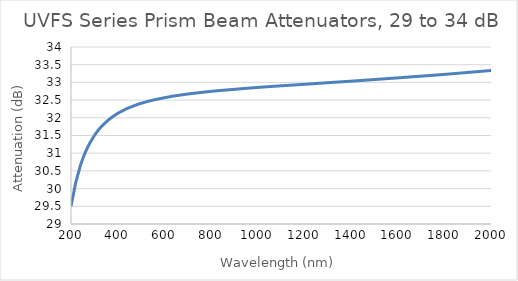
| Category | UVFS Series Prism Beam Attenuators, 29 to 34 dB |
|---|---|
| 200.0 | 29.499 |
| 210.0 | 29.828 |
| 220.0 | 30.166 |
| 230.0 | 30.404 |
| 240.0 | 30.647 |
| 250.0 | 30.837 |
| 260.0 | 31.004 |
| 270.0 | 31.149 |
| 280.0 | 31.28 |
| 290.0 | 31.389 |
| 300.0 | 31.499 |
| 310.0 | 31.592 |
| 320.0 | 31.676 |
| 330.0 | 31.75 |
| 340.0 | 31.817 |
| 350.0 | 31.877 |
| 360.0 | 31.938 |
| 370.0 | 31.988 |
| 380.0 | 32.038 |
| 390.0 | 32.081 |
| 400.0 | 32.124 |
| 410.0 | 32.161 |
| 420.0 | 32.194 |
| 430.0 | 32.228 |
| 440.0 | 32.261 |
| 450.0 | 32.288 |
| 460.0 | 32.314 |
| 470.0 | 32.339 |
| 480.0 | 32.365 |
| 490.0 | 32.388 |
| 500.0 | 32.407 |
| 510.0 | 32.427 |
| 520.0 | 32.446 |
| 530.0 | 32.465 |
| 540.0 | 32.482 |
| 550.0 | 32.497 |
| 560.0 | 32.511 |
| 570.0 | 32.526 |
| 580.0 | 32.54 |
| 590.0 | 32.554 |
| 600.0 | 32.567 |
| 610.0 | 32.579 |
| 620.0 | 32.591 |
| 630.0 | 32.604 |
| 640.0 | 32.614 |
| 650.0 | 32.624 |
| 660.0 | 32.634 |
| 670.0 | 32.643 |
| 680.0 | 32.653 |
| 690.0 | 32.663 |
| 700.0 | 32.672 |
| 710.0 | 32.68 |
| 720.0 | 32.688 |
| 730.0 | 32.695 |
| 740.0 | 32.703 |
| 750.0 | 32.711 |
| 760.0 | 32.718 |
| 770.0 | 32.725 |
| 780.0 | 32.733 |
| 790.0 | 32.74 |
| 800.0 | 32.747 |
| 810.0 | 32.753 |
| 820.0 | 32.759 |
| 830.0 | 32.765 |
| 840.0 | 32.771 |
| 850.0 | 32.777 |
| 860.0 | 32.783 |
| 870.0 | 32.788 |
| 880.0 | 32.793 |
| 890.0 | 32.799 |
| 900.0 | 32.804 |
| 910.0 | 32.81 |
| 920.0 | 32.816 |
| 930.0 | 32.821 |
| 940.0 | 32.826 |
| 950.0 | 32.831 |
| 960.0 | 32.836 |
| 970.0 | 32.842 |
| 980.0 | 32.847 |
| 990.0 | 32.852 |
| 1000.0 | 32.857 |
| 1010.0 | 32.862 |
| 1020.0 | 32.867 |
| 1030.0 | 32.872 |
| 1040.0 | 32.877 |
| 1050.0 | 32.881 |
| 1060.0 | 32.886 |
| 1070.0 | 32.891 |
| 1080.0 | 32.895 |
| 1090.0 | 32.899 |
| 1100.0 | 32.904 |
| 1110.0 | 32.908 |
| 1120.0 | 32.912 |
| 1130.0 | 32.916 |
| 1140.0 | 32.921 |
| 1150.0 | 32.925 |
| 1160.0 | 32.929 |
| 1170.0 | 32.933 |
| 1180.0 | 32.937 |
| 1190.0 | 32.942 |
| 1200.0 | 32.946 |
| 1210.0 | 32.95 |
| 1220.0 | 32.955 |
| 1230.0 | 32.959 |
| 1240.0 | 32.964 |
| 1250.0 | 32.968 |
| 1260.0 | 32.973 |
| 1270.0 | 32.977 |
| 1280.0 | 32.982 |
| 1290.0 | 32.986 |
| 1300.0 | 32.991 |
| 1310.0 | 32.996 |
| 1320.0 | 33 |
| 1330.0 | 33.004 |
| 1340.0 | 33.009 |
| 1350.0 | 33.013 |
| 1360.0 | 33.017 |
| 1370.0 | 33.022 |
| 1380.0 | 33.026 |
| 1390.0 | 33.03 |
| 1400.0 | 33.034 |
| 1410.0 | 33.039 |
| 1420.0 | 33.044 |
| 1430.0 | 33.048 |
| 1440.0 | 33.053 |
| 1450.0 | 33.058 |
| 1460.0 | 33.062 |
| 1470.0 | 33.067 |
| 1480.0 | 33.072 |
| 1490.0 | 33.076 |
| 1500.0 | 33.081 |
| 1510.0 | 33.086 |
| 1520.0 | 33.09 |
| 1530.0 | 33.095 |
| 1540.0 | 33.1 |
| 1550.0 | 33.104 |
| 1560.0 | 33.109 |
| 1570.0 | 33.114 |
| 1580.0 | 33.118 |
| 1590.0 | 33.123 |
| 1600.0 | 33.128 |
| 1610.0 | 33.133 |
| 1620.0 | 33.138 |
| 1630.0 | 33.142 |
| 1640.0 | 33.147 |
| 1650.0 | 33.152 |
| 1660.0 | 33.157 |
| 1670.0 | 33.162 |
| 1680.0 | 33.167 |
| 1690.0 | 33.172 |
| 1700.0 | 33.177 |
| 1710.0 | 33.182 |
| 1720.0 | 33.186 |
| 1730.0 | 33.191 |
| 1740.0 | 33.196 |
| 1750.0 | 33.201 |
| 1760.0 | 33.206 |
| 1770.0 | 33.211 |
| 1780.0 | 33.216 |
| 1790.0 | 33.221 |
| 1800.0 | 33.226 |
| 1810.0 | 33.231 |
| 1820.0 | 33.237 |
| 1830.0 | 33.242 |
| 1840.0 | 33.248 |
| 1850.0 | 33.253 |
| 1860.0 | 33.259 |
| 1870.0 | 33.264 |
| 1880.0 | 33.27 |
| 1890.0 | 33.275 |
| 1900.0 | 33.281 |
| 1910.0 | 33.286 |
| 1920.0 | 33.292 |
| 1930.0 | 33.297 |
| 1940.0 | 33.303 |
| 1950.0 | 33.308 |
| 1960.0 | 33.314 |
| 1970.0 | 33.32 |
| 1980.0 | 33.325 |
| 1990.0 | 33.331 |
| 2000.0 | 33.336 |